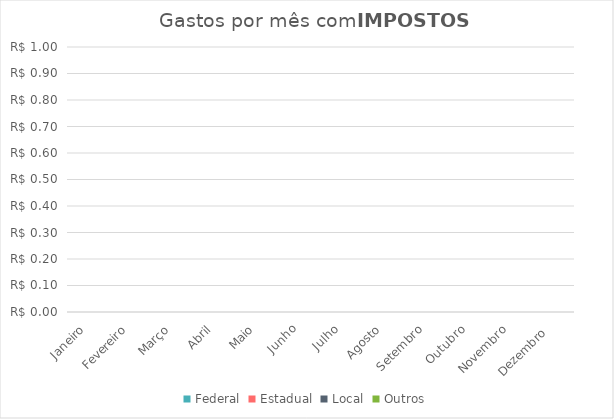
| Category | Federal | Estadual | Local | Outros |
|---|---|---|---|---|
| Janeiro | 0 | 0 | 0 | 0 |
| Fevereiro | 0 | 0 | 0 | 0 |
| Março | 0 | 0 | 0 | 0 |
| Abril | 0 | 0 | 0 | 0 |
| Maio | 0 | 0 | 0 | 0 |
| Junho | 0 | 0 | 0 | 0 |
| Julho | 0 | 0 | 0 | 0 |
| Agosto | 0 | 0 | 0 | 0 |
| Setembro | 0 | 0 | 0 | 0 |
| Outubro | 0 | 0 | 0 | 0 |
| Novembro | 0 | 0 | 0 | 0 |
| Dezembro  | 0 | 0 | 0 | 0 |